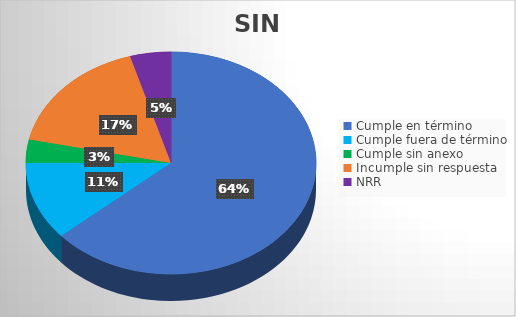
| Category | TOTAL |
|---|---|
| Cumple en término | 112 |
| Cumple fuera de término | 20 |
| Cumple sin anexo | 6 |
| Incumple sin respuesta | 30 |
| NRR | 8 |